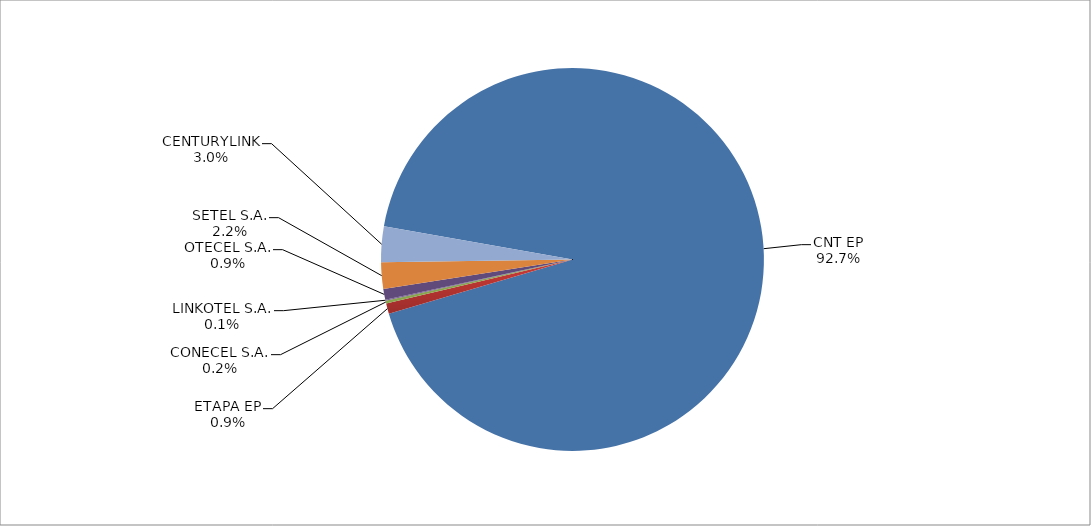
| Category | Series 0 |
|---|---|
| CNT EP | 2709 |
| ETAPA EP | 26 |
| CONECEL S.A. | 7 |
| LINKOTEL S.A. | 2 |
| OTECEL S.A. | 27 |
| SETEL S.A. | 65 |
| CENTURYLINK | 88 |